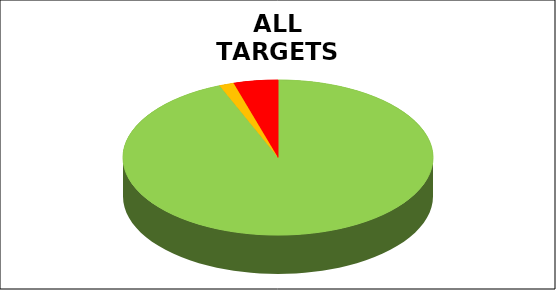
| Category | Series 0 |
|---|---|
| Green | 0.938 |
| Amber | 0.015 |
| Red | 0.046 |